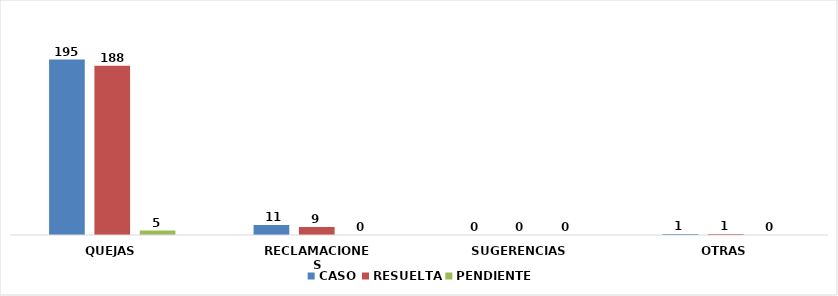
| Category | CASO | RESUELTA | PENDIENTE |
|---|---|---|---|
| QUEJAS | 195 | 188 | 5 |
| RECLAMACIONES | 11 | 9 | 0 |
| SUGERENCIAS | 0 | 0 | 0 |
| OTRAS | 1 | 1 | 0 |